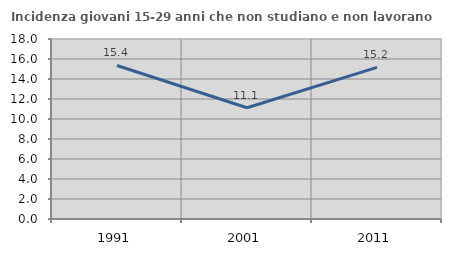
| Category | Incidenza giovani 15-29 anni che non studiano e non lavorano  |
|---|---|
| 1991.0 | 15.351 |
| 2001.0 | 11.124 |
| 2011.0 | 15.162 |